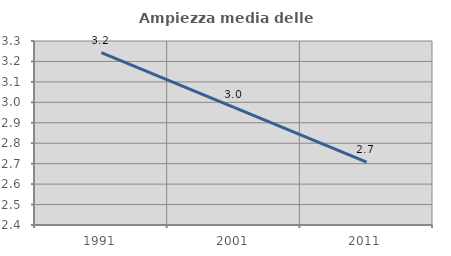
| Category | Ampiezza media delle famiglie |
|---|---|
| 1991.0 | 3.243 |
| 2001.0 | 2.975 |
| 2011.0 | 2.708 |